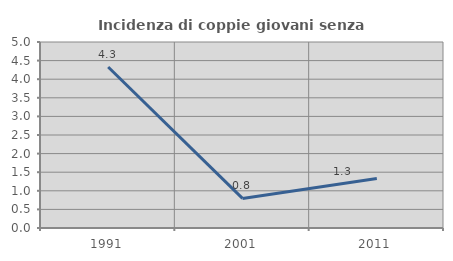
| Category | Incidenza di coppie giovani senza figli |
|---|---|
| 1991.0 | 4.327 |
| 2001.0 | 0.796 |
| 2011.0 | 1.329 |